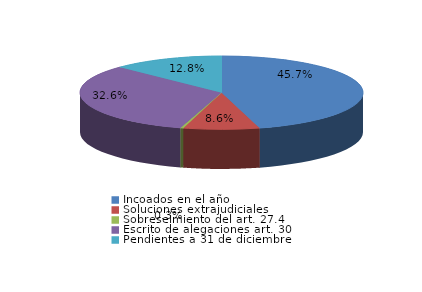
| Category | Series 0 |
|---|---|
| Incoados en el año | 931 |
| Soluciones extrajudiciales | 176 |
| Sobreseimiento del art. 27.4 | 7 |
| Escrito de alegaciones art. 30 | 664 |
| Pendientes a 31 de diciembre | 260 |